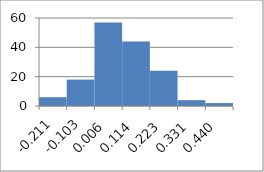
| Category | Series 0 |
|---|---|
| -0.211435016301738 | 6 |
| -0.10294315874607197 | 18 |
| 0.005548698809594049 | 57 |
| 0.11404055636526007 | 44 |
| 0.2225324139209261 | 24 |
| 0.33102427147659214 | 4 |
| 0.43951612903225806 | 2 |